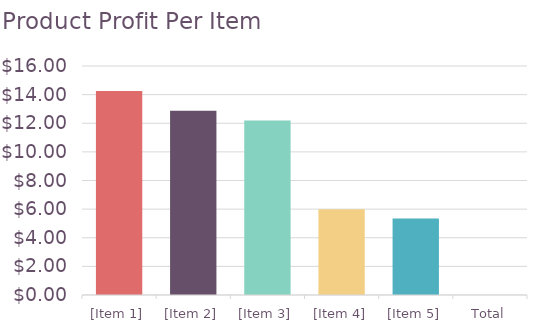
| Category | Profit per Item (incl. shipping) |
|---|---|
| [Item 1] | 14.25 |
| [Item 2] | 12.875 |
| [Item 3] | 12.2 |
| [Item 4] | 6 |
| [Item 5] | 5.35 |